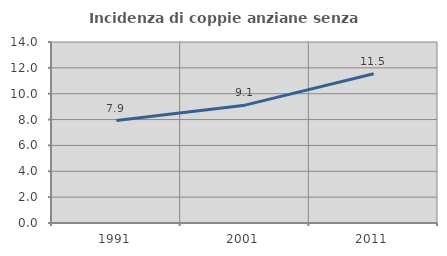
| Category | Incidenza di coppie anziane senza figli  |
|---|---|
| 1991.0 | 7.923 |
| 2001.0 | 9.115 |
| 2011.0 | 11.545 |